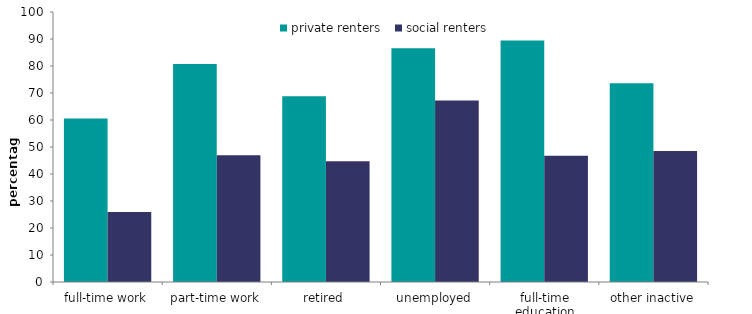
| Category | private renters | social renters |
|---|---|---|
| full-time work | 60.519 | 25.948 |
| part-time work | 80.718 | 46.924 |
| retired | 68.837 | 44.767 |
| unemployed | 86.607 | 67.206 |
| full-time education | 89.431 | 46.787 |
| other inactive | 73.577 | 48.517 |